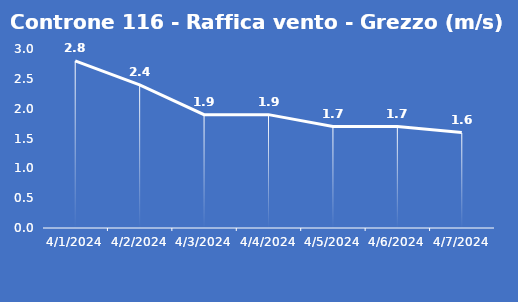
| Category | Controne 116 - Raffica vento - Grezzo (m/s) |
|---|---|
| 4/1/24 | 2.8 |
| 4/2/24 | 2.4 |
| 4/3/24 | 1.9 |
| 4/4/24 | 1.9 |
| 4/5/24 | 1.7 |
| 4/6/24 | 1.7 |
| 4/7/24 | 1.6 |